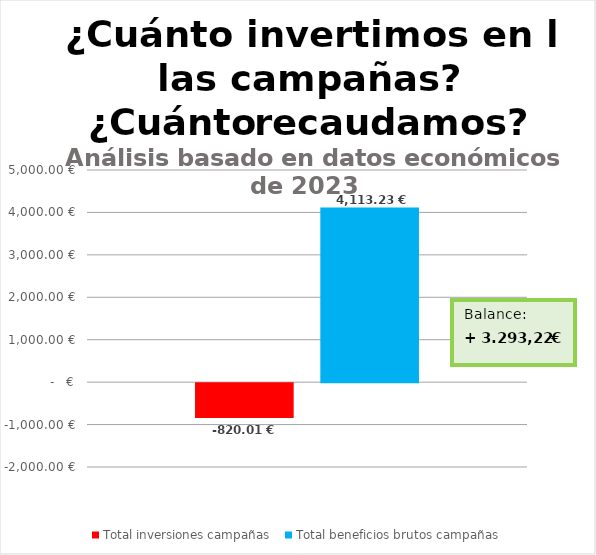
| Category | Total inversiones campañas  | Total beneficios brutos campañas |
|---|---|---|
| 0 | -820.01 | 4113.23 |